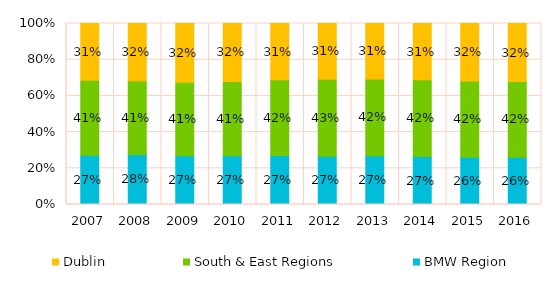
| Category | BMW Region | South & East Regions | Dublin |
|---|---|---|---|
| 2007.0 | 0.27 | 0.412 | 0.311 |
| 2008.0 | 0.276 | 0.408 | 0.316 |
| 2009.0 | 0.27 | 0.406 | 0.325 |
| 2010.0 | 0.269 | 0.411 | 0.32 |
| 2011.0 | 0.271 | 0.419 | 0.31 |
| 2012.0 | 0.266 | 0.425 | 0.309 |
| 2013.0 | 0.27 | 0.424 | 0.307 |
| 2014.0 | 0.265 | 0.424 | 0.311 |
| 2015.0 | 0.263 | 0.423 | 0.32 |
| 2016.0 | 0.262 | 0.417 | 0.321 |